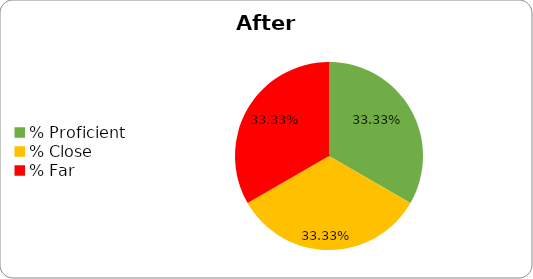
| Category | Series 0 |
|---|---|
| % Proficient | 0.333 |
| % Close | 0.333 |
| % Far | 0.333 |